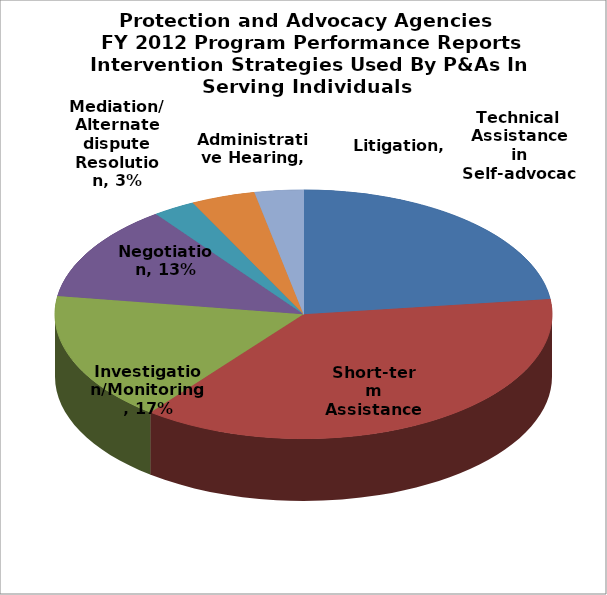
| Category | Series 0 |
|---|---|
| Technical Assistance in Self-advocacy  | 0.23 |
| Short-term Assistance | 0.375 |
| Investigation/Monitoring | 0.168 |
| Negotiation | 0.126 |
| Mediation/Alternate dispute Resolution | 0.028 |
| Administrative Hearing | 0.042 |
| Litigation | 0.032 |